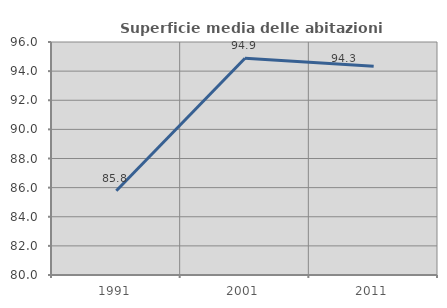
| Category | Superficie media delle abitazioni occupate |
|---|---|
| 1991.0 | 85.788 |
| 2001.0 | 94.882 |
| 2011.0 | 94.337 |